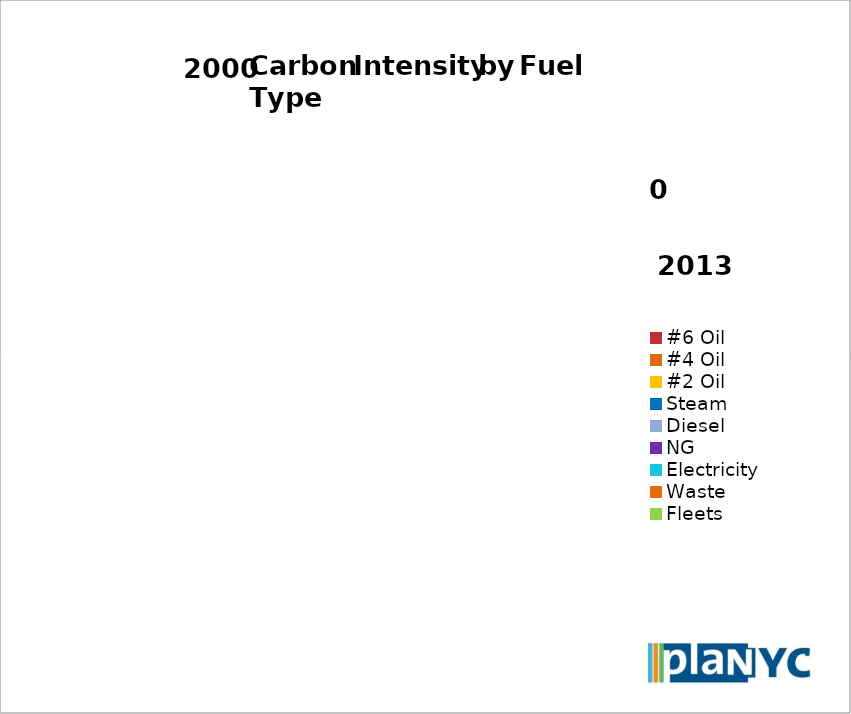
| Category | Series 0 |
|---|---|
| #6 Oil | 0 |
| #4 Oil | 0 |
| #2 Oil | 0 |
| Steam | 0 |
| Diesel | 0 |
| NG | 0 |
| Electricity | 0 |
| Waste | 0 |
| Fleets | 0 |